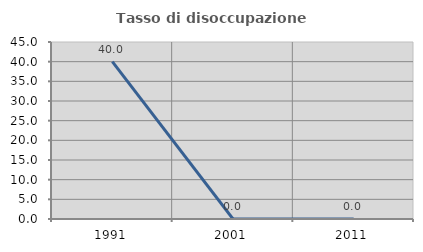
| Category | Tasso di disoccupazione giovanile  |
|---|---|
| 1991.0 | 40 |
| 2001.0 | 0 |
| 2011.0 | 0 |